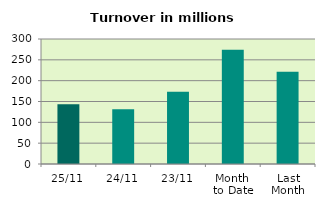
| Category | Series 0 |
|---|---|
| 25/11 | 143.625 |
| 24/11 | 131.693 |
| 23/11 | 173.522 |
| Month 
to Date | 274.5 |
| Last
Month | 221.516 |